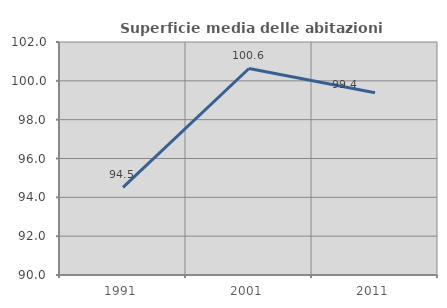
| Category | Superficie media delle abitazioni occupate |
|---|---|
| 1991.0 | 94.512 |
| 2001.0 | 100.636 |
| 2011.0 | 99.383 |